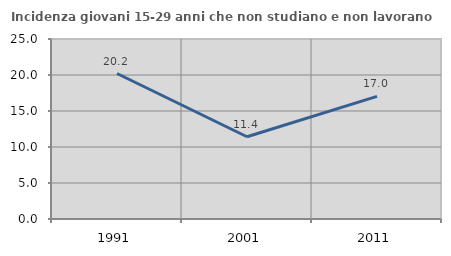
| Category | Incidenza giovani 15-29 anni che non studiano e non lavorano  |
|---|---|
| 1991.0 | 20.207 |
| 2001.0 | 11.427 |
| 2011.0 | 17.03 |